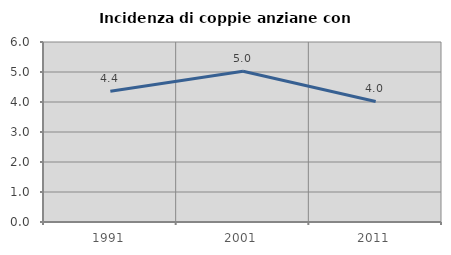
| Category | Incidenza di coppie anziane con figli |
|---|---|
| 1991.0 | 4.355 |
| 2001.0 | 5.025 |
| 2011.0 | 4.019 |